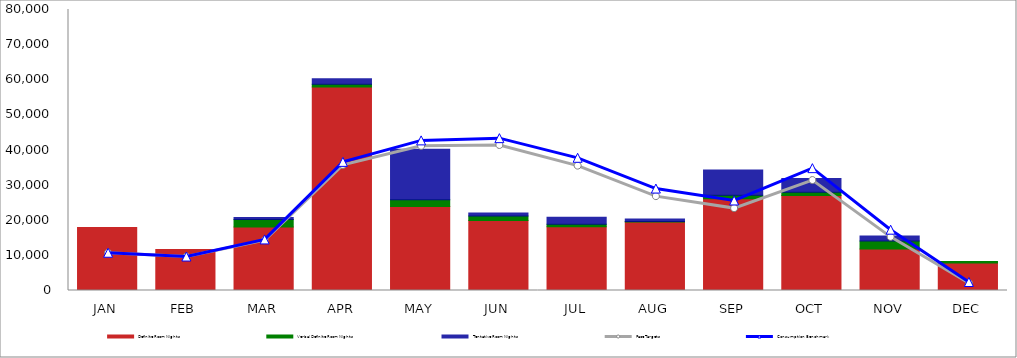
| Category | Definite Room Nights | Verbal Definite Room Nights | Tentative Room Nights |
|---|---|---|---|
| JAN | 17918 | 0 | 0 |
| FEB | 11670 | 0 | 0 |
| MAR | 18085 | 2160 | 560 |
| APR | 57967 | 726 | 1618 |
| MAY | 23896 | 1958 | 14337 |
| JUN | 19907 | 1285 | 864 |
| JUL | 18154 | 682 | 2039 |
| AUG | 19488 | 150 | 720 |
| SEP | 26098 | 985 | 7236 |
| OCT | 27043 | 918 | 3930 |
| NOV | 11813 | 2272 | 1437 |
| DEC | 7818 | 440 | 0 |